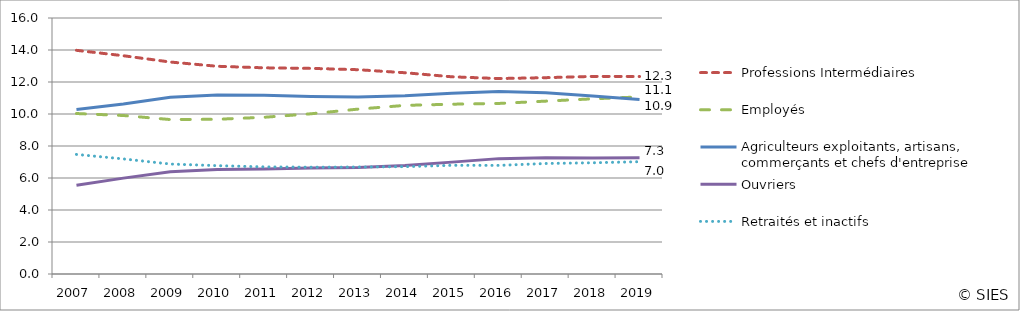
| Category | Professions Intermédiaires | Employés | Agriculteurs exploitants, artisans, commerçants et chefs d'entreprise | Ouvriers | Retraités et inactifs |
|---|---|---|---|---|---|
| 2007.0 | 13.98 | 10.03 | 10.283 | 5.552 | 7.475 |
| 2008.0 | 13.641 | 9.906 | 10.626 | 5.993 | 7.192 |
| 2009.0 | 13.248 | 9.653 | 11.044 | 6.384 | 6.872 |
| 2010.0 | 12.983 | 9.67 | 11.194 | 6.529 | 6.771 |
| 2011.0 | 12.886 | 9.795 | 11.17 | 6.562 | 6.695 |
| 2012.0 | 12.852 | 10.014 | 11.1 | 6.618 | 6.675 |
| 2013.0 | 12.769 | 10.305 | 11.056 | 6.654 | 6.685 |
| 2014.0 | 12.579 | 10.538 | 11.135 | 6.781 | 6.709 |
| 2015.0 | 12.325 | 10.612 | 11.302 | 6.992 | 6.793 |
| 2016.0 | 12.216 | 10.659 | 11.4 | 7.211 | 6.788 |
| 2017.0 | 12.271 | 10.804 | 11.326 | 7.264 | 6.906 |
| 2018.0 | 12.349 | 10.948 | 11.127 | 7.246 | 6.95 |
| 2019.0 | 12.344 | 11.068 | 10.912 | 7.272 | 7.018 |